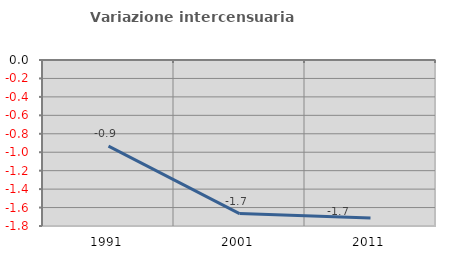
| Category | Variazione intercensuaria annua |
|---|---|
| 1991.0 | -0.934 |
| 2001.0 | -1.665 |
| 2011.0 | -1.713 |